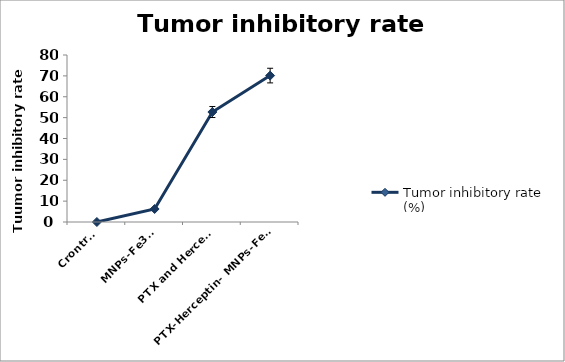
| Category | Tumor inhibitory rate (%) |
|---|---|
| Crontrol | 0 |
| MNPs-Fe3O4 | 6.23 |
| PTX and Herceptin | 52.68 |
| PTX-Herceptin- MNPs-Fe3O4  | 70.14 |